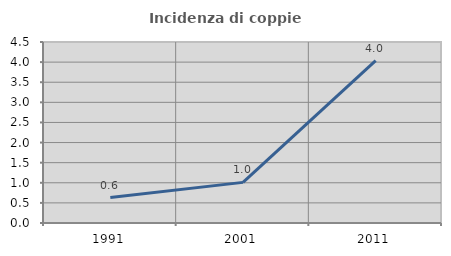
| Category | Incidenza di coppie miste |
|---|---|
| 1991.0 | 0.632 |
| 2001.0 | 1.01 |
| 2011.0 | 4.036 |